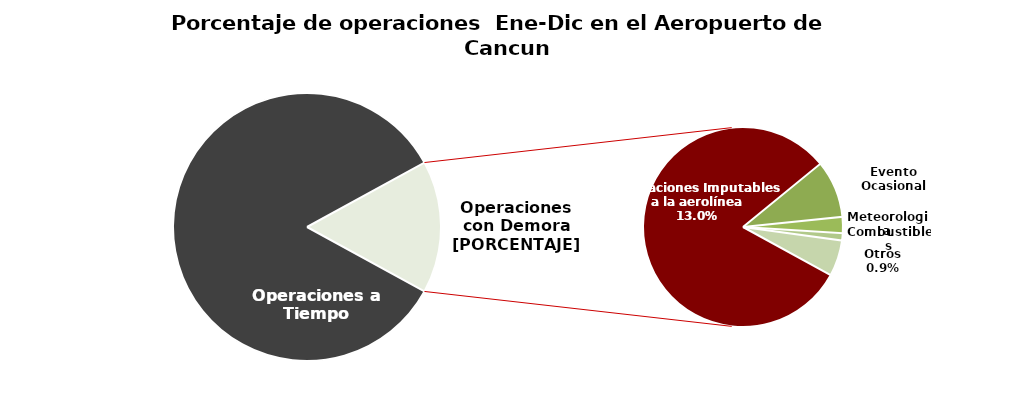
| Category | Series 0 |
|---|---|
| Operaciones a Tiempo | 63383 |
| Operaciones Imputables a la aerolínea | 9774 |
| Evento Ocasional | 1118 |
| Meteorologia | 317 |
| Combustibles | 141 |
| Otros | 701 |